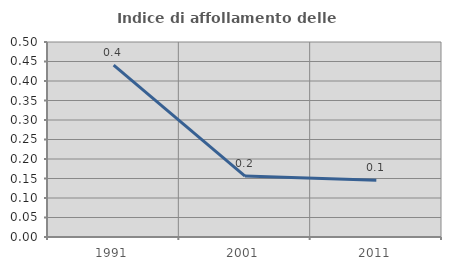
| Category | Indice di affollamento delle abitazioni  |
|---|---|
| 1991.0 | 0.441 |
| 2001.0 | 0.156 |
| 2011.0 | 0.145 |